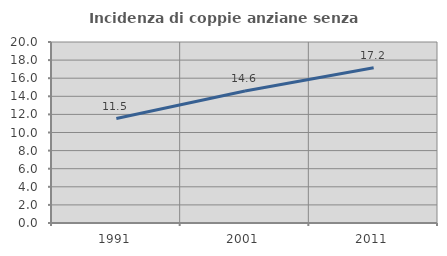
| Category | Incidenza di coppie anziane senza figli  |
|---|---|
| 1991.0 | 11.541 |
| 2001.0 | 14.59 |
| 2011.0 | 17.164 |